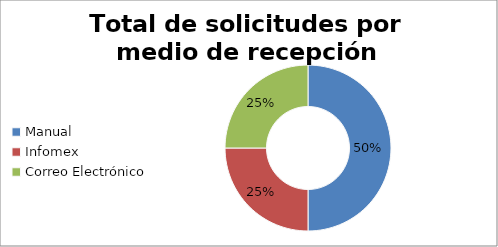
| Category | totales |
|---|---|
| Manual | 4 |
| Infomex | 2 |
| Correo Electrónico | 2 |